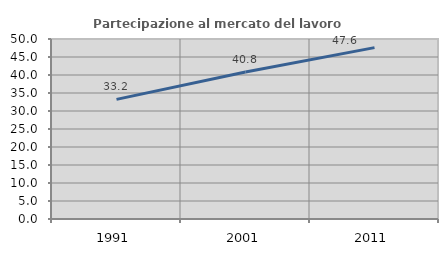
| Category | Partecipazione al mercato del lavoro  femminile |
|---|---|
| 1991.0 | 33.221 |
| 2001.0 | 40.827 |
| 2011.0 | 47.601 |